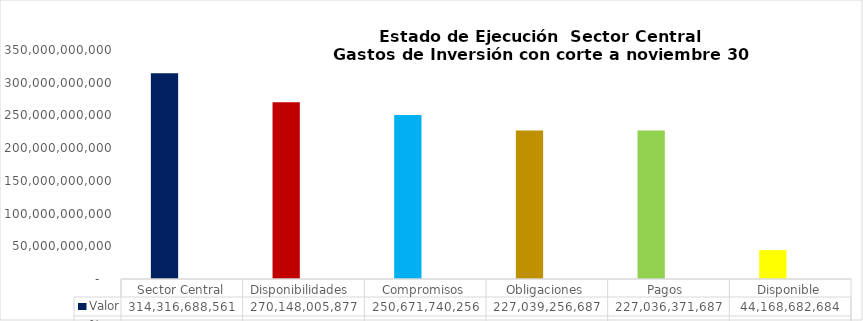
| Category | Valor | % |
|---|---|---|
| Sector Central | 314316688561.2 | 1 |
| Disponibilidades  | 270148005877.14 | 0.859 |
| Compromisos | 250671740255.74 | 0.798 |
| Obligaciones | 227039256687.31 | 0.906 |
| Pagos  | 227036371687.31 | 0.906 |
|  Disponible  | 44168682684.06 | 0.141 |